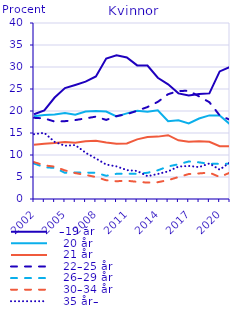
| Category |   –19 år |    20 år |    21 år |    22–25 år |    26–29 år |    30–34 år |    35 år– |
|---|---|---|---|---|---|---|---|
| 2002.0 | 19.267 | 18.788 | 12.316 | 18.448 | 8.055 | 8.389 | 14.736 |
| 2003.0 | 20.13 | 19.066 | 12.578 | 18.321 | 7.232 | 7.638 | 15.035 |
| 2004.0 | 23.055 | 19.228 | 12.728 | 17.602 | 7.059 | 7.352 | 12.976 |
| 2005.0 | 25.214 | 19.563 | 12.978 | 17.688 | 5.956 | 6.498 | 12.103 |
| 2006.0 | 25.916 | 19.168 | 12.8 | 17.94 | 6.027 | 5.885 | 12.264 |
| 2007.0 | 26.672 | 19.876 | 13.138 | 18.321 | 5.996 | 5.475 | 10.522 |
| 2008.0 | 27.845 | 20.02 | 13.257 | 18.72 | 5.959 | 4.993 | 9.206 |
| 2009.0 | 31.913 | 19.89 | 12.858 | 17.972 | 5.273 | 4.261 | 7.832 |
| 2010.0 | 32.66 | 18.752 | 12.569 | 18.849 | 5.725 | 4.036 | 7.408 |
| 2011.0 | 32.179 | 19.463 | 12.623 | 19.269 | 5.751 | 4.153 | 6.562 |
| 2012.0 | 30.364 | 20.037 | 13.554 | 20.049 | 5.719 | 3.902 | 6.374 |
| 2013.0 | 30.316 | 19.817 | 14.102 | 20.898 | 5.959 | 3.729 | 5.18 |
| 2014.0 | 27.556 | 20.171 | 14.177 | 22.069 | 6.523 | 3.818 | 5.685 |
| 2015.0 | 26.064 | 17.662 | 14.502 | 23.817 | 7.399 | 4.287 | 6.269 |
| 2016.0 | 24.007 | 17.87 | 13.327 | 24.551 | 7.897 | 4.986 | 7.362 |
| 2017.0 | 23.532 | 17.177 | 12.986 | 24.595 | 8.523 | 5.672 | 7.516 |
| 2018.0 | 23.875 | 18.292 | 13.122 | 23.322 | 8.325 | 5.813 | 7.252 |
| 2019.0 | 24 | 19 | 13 | 22 | 8 | 6 | 8.072 |
| 2020.0 | 29 | 19 | 12 | 19 | 8 | 5 | 6.664 |
| 2021.0 | 30 | 17 | 12 | 18 | 8 | 6 | 8.328 |